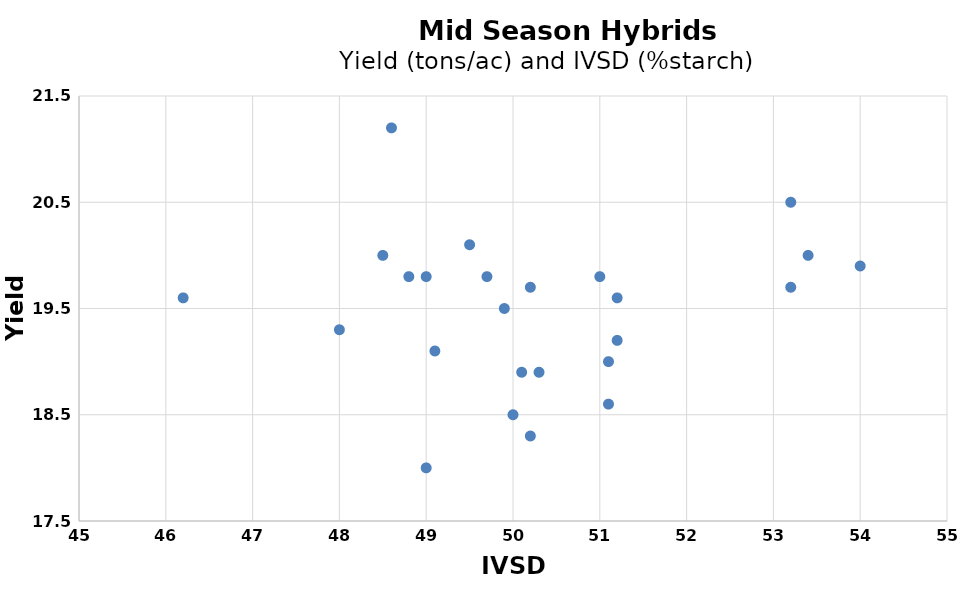
| Category | Series 0 |
|---|---|
| 49.1 | 19.1 |
| 49.0 | 18 |
| 49.0 | 19.8 |
| 51.1 | 19 |
| 51.2 | 19.2 |
| 50.3 | 18.9 |
| 50.1 | 18.9 |
| 49.5 | 20.1 |
| 51.2 | 19.6 |
| 53.2 | 20.5 |
| 48.6 | 21.2 |
| 48.0 | 19.3 |
| 53.4 | 20 |
| 46.2 | 19.6 |
| 53.2 | 19.7 |
| 49.7 | 19.8 |
| 51.1 | 18.6 |
| 50.0 | 18.5 |
| 51.0 | 19.8 |
| 48.8 | 19.8 |
| 49.9 | 19.5 |
| 50.2 | 19.7 |
| 54.0 | 19.9 |
| 48.5 | 20 |
| 50.2 | 18.3 |